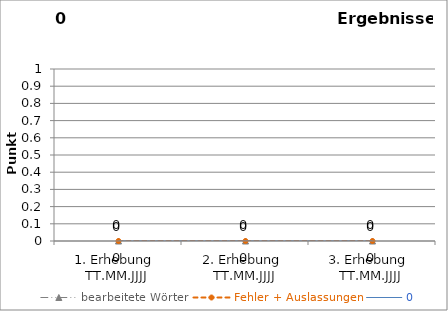
| Category | bearbeitete Wörter | Fehler + Auslassungen | 0 |
|---|---|---|---|
| 1. Erhebung 
TT.MM.JJJJ | 0 | 0 | 0 |
| 2. Erhebung 
TT.MM.JJJJ | 0 | 0 | 0 |
| 3. Erhebung 
TT.MM.JJJJ | 0 | 0 | 0 |